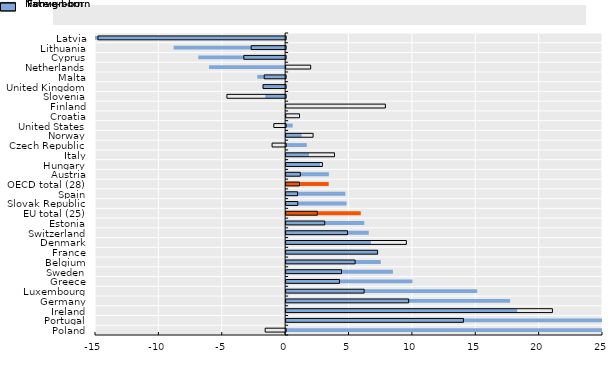
| Category | Foreign-born | Native-born |
|---|---|---|
| Poland | 26.343 | -1.613 |
| Portugal | 26.076 | 13.989 |
| Ireland | 18.232 | 21.009 |
| Germany | 17.673 | 9.671 |
| Luxembourg | 15.073 | 6.154 |
| Greece | 9.966 | 4.212 |
| Sweden | 8.425 | 4.371 |
| Belgium | 7.47 | 5.444 |
| France | 7.248 | 7.218 |
| Denmark | 6.691 | 9.486 |
| Switzerland | 6.522 | 4.846 |
| Estonia | 6.164 | 3.048 |
| EU total (25) | 5.889 | 2.462 |
| Slovak Republic | 4.768 | 0.921 |
| Spain | 4.674 | 0.906 |
| OECD total (28) | 3.358 | 1.053 |
| Austria | 3.371 | 1.118 |
| Hungary | 2.691 | 2.862 |
| Italy | 1.8 | 3.817 |
| Czech Republic | 1.628 | -1.068 |
| Norway | 1.219 | 2.129 |
| United States | 0.518 | -0.933 |
| Croatia | 0.045 | 1.056 |
| Finland | 0.03 | 7.833 |
| Slovenia | -1.569 | -4.632 |
| United Kingdom | -1.779 | -1.782 |
| Malta | -2.195 | -1.691 |
| Netherlands | -6.002 | 1.937 |
| Cyprus | -6.849 | -3.301 |
| Lithuania | -8.793 | -2.719 |
| Latvia | -16.602 | -14.806 |